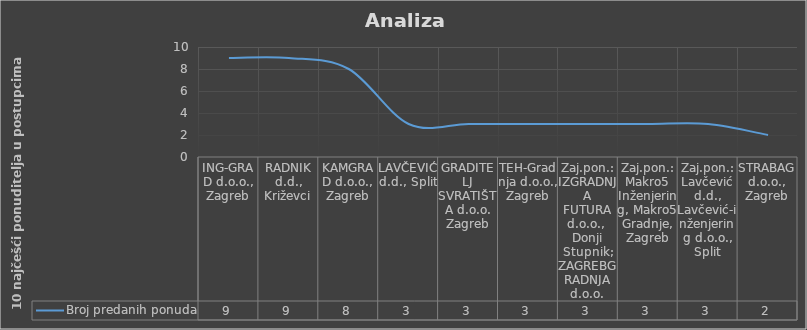
| Category | Broj predanih ponuda |
|---|---|
| ING-GRAD d.o.o., Zagreb | 9 |
| RADNIK d.d., Križevci | 9 |
| KAMGRAD d.o.o., Zagreb | 8 |
| LAVČEVIĆ d.d., Split | 3 |
| GRADITELJ SVRATIŠTA d.o.o. Zagreb | 3 |
| TEH-Gradnja d.o.o., Zagreb | 3 |
| Zaj.pon.: IZGRADNJA FUTURA d.o.o., 
Donji Stupnik; ZAGREBGRADNJA d.o.o. | 3 |
| Zaj.pon.: Makro5 Inženjering, Makro5 Gradnje, Zagreb | 3 |
| Zaj.pon.: Lavčević d.d., Lavčević-inženjering d.o.o., Split | 3 |
| STRABAG d.o.o., Zagreb | 2 |